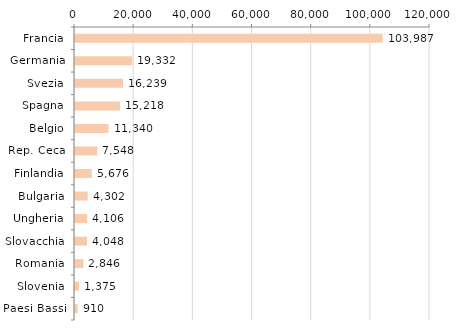
| Category | Series 0 |
|---|---|
| Francia | 103987 |
| Germania | 19332 |
| Svezia | 16239 |
| Spagna | 15218 |
| Belgio | 11340.477 |
| Rep. Ceca | 7548.204 |
| Finlandia | 5675.9 |
| Bulgaria | 4301.762 |
| Ungheria | 4106 |
| Slovacchia | 4048 |
| Romania | 2846 |
| Slovenia | 1375.2 |
| Paesi Bassi | 910.31 |